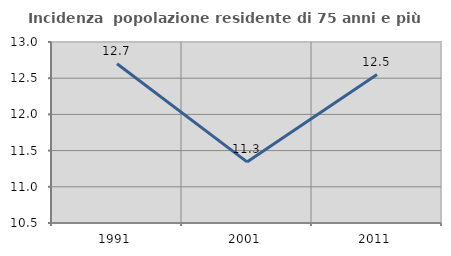
| Category | Incidenza  popolazione residente di 75 anni e più |
|---|---|
| 1991.0 | 12.7 |
| 2001.0 | 11.344 |
| 2011.0 | 12.55 |